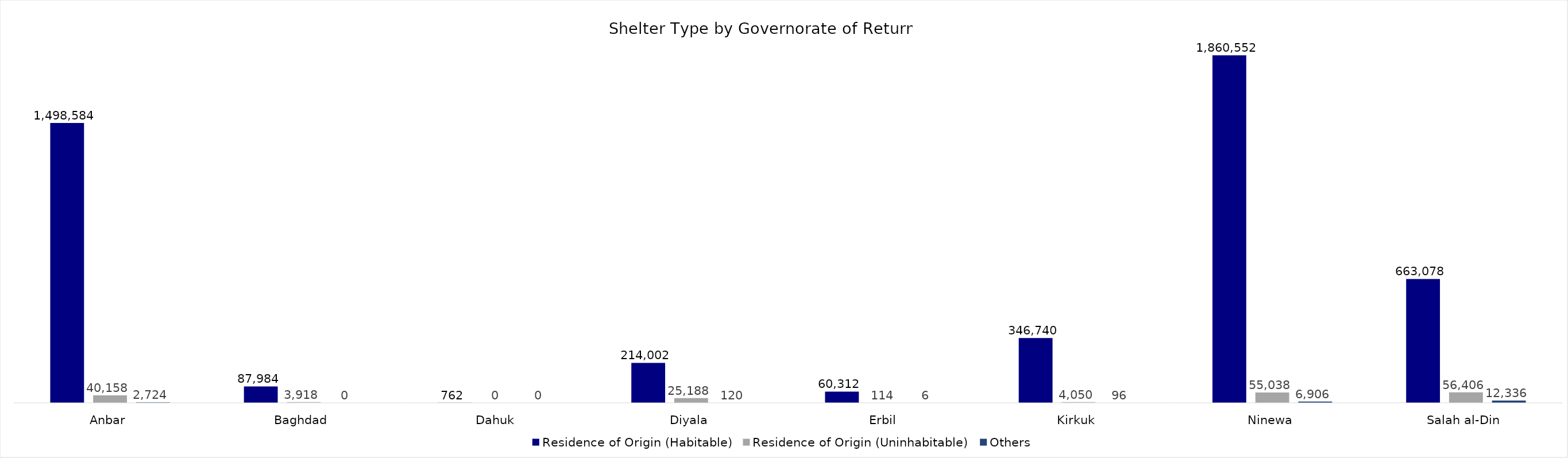
| Category | Residence of Origin (Habitable) | Residence of Origin (Uninhabitable) | Others |
|---|---|---|---|
| Anbar | 1498584 | 40158 | 2724 |
| Baghdad | 87984 | 3918 | 0 |
| Dahuk | 762 | 0 | 0 |
| Diyala | 214002 | 25188 | 120 |
| Erbil | 60312 | 114 | 6 |
| Kirkuk | 346740 | 4050 | 96 |
| Ninewa | 1860552 | 55038 | 6906 |
| Salah al-Din | 663078 | 56406 | 12336 |